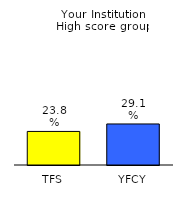
| Category | Series 0 |
|---|---|
| TFS | 0.238 |
| YFCY | 0.291 |